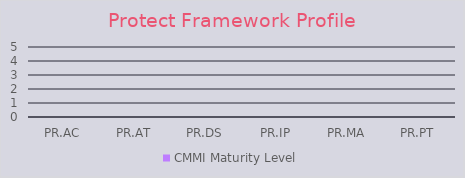
| Category | CMMI Maturity Level |
|---|---|
| PR.AC | 0 |
| PR.AT | 0 |
| PR.DS | 0 |
| PR.IP | 0 |
| PR.MA | 0 |
| PR.PT | 0 |